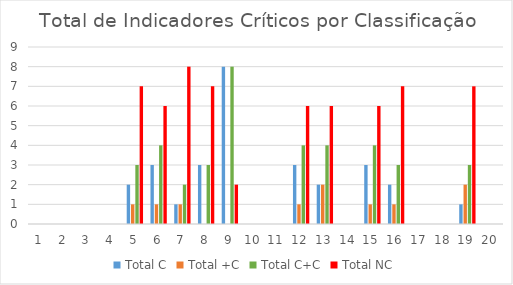
| Category | Total C | Total +C | Total C+C | Total NC |
|---|---|---|---|---|
| 0 | 0 | 0 | 0 | 0 |
| 1 | 0 | 0 | 0 | 0 |
| 2 | 0 | 0 | 0 | 0 |
| 3 | 0 | 0 | 0 | 0 |
| 4 | 2 | 1 | 3 | 7 |
| 5 | 3 | 1 | 4 | 6 |
| 6 | 1 | 1 | 2 | 8 |
| 7 | 3 | 0 | 3 | 7 |
| 8 | 8 | 0 | 8 | 2 |
| 9 | 0 | 0 | 0 | 0 |
| 10 | 0 | 0 | 0 | 0 |
| 11 | 3 | 1 | 4 | 6 |
| 12 | 2 | 2 | 4 | 6 |
| 13 | 0 | 0 | 0 | 0 |
| 14 | 3 | 1 | 4 | 6 |
| 15 | 2 | 1 | 3 | 7 |
| 16 | 0 | 0 | 0 | 0 |
| 17 | 0 | 0 | 0 | 0 |
| 18 | 1 | 2 | 3 | 7 |
| 19 | 0 | 0 | 0 | 0 |